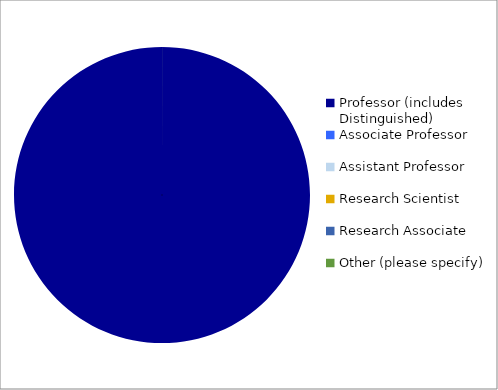
| Category | Series 0 |
|---|---|
| Professor (includes Distinguished) | 1 |
| Associate Professor | 0 |
| Assistant Professor | 0 |
| Research Scientist | 0 |
| Research Associate | 0 |
| Other (please specify) | 0 |